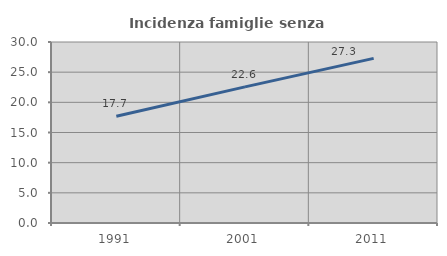
| Category | Incidenza famiglie senza nuclei |
|---|---|
| 1991.0 | 17.704 |
| 2001.0 | 22.557 |
| 2011.0 | 27.282 |